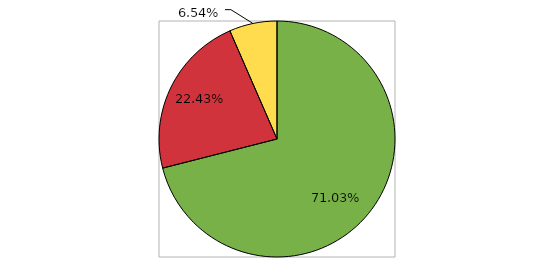
| Category | Series 0 |
|---|---|
| 0 | 0.71 |
| 1 | 0.224 |
| 2 | 0.065 |